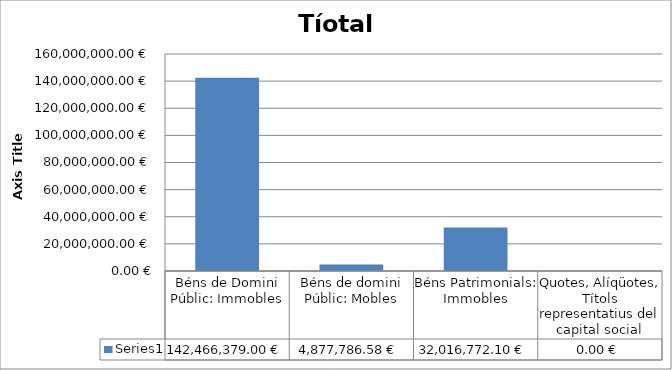
| Category | Series 0 |
|---|---|
| Béns de Domini Públic: Immobles | 142466379 |
| Béns de domini Públic: Mobles | 4877786.58 |
| Béns Patrimonials: Immobles | 32016772.1 |
| Quotes, Alíqüotes, Títols representatius del capital social | 0 |